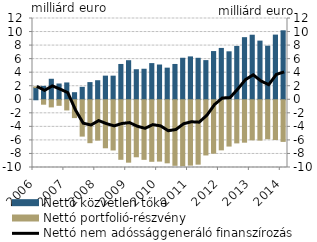
| Category | Nettó közvetlen tőke | Nettó portfolió-részvény |
|---|---|---|
| 2006.0 | 1.794 | 0.12 |
| 2006.0 | 1.974 | -0.655 |
| 2006.0 | 3.027 | -1.052 |
| 2006.0 | 2.327 | -0.819 |
| 2007.0 | 2.485 | -1.502 |
| 2007.0 | 1.045 | -2.631 |
| 2007.0 | 1.836 | -5.366 |
| 2007.0 | 2.537 | -6.338 |
| 2008.0 | 2.813 | -5.96 |
| 2008.0 | 3.491 | -7.088 |
| 2008.0 | 3.487 | -7.411 |
| 2008.0 | 5.213 | -8.79 |
| 2009.0 | 5.768 | -9.214 |
| 2009.0 | 4.436 | -8.417 |
| 2009.0 | 4.508 | -8.796 |
| 2009.0 | 5.342 | -9.085 |
| 2010.0 | 5.133 | -9.055 |
| 2010.0 | 4.669 | -9.31 |
| 2010.0 | 5.214 | -9.678 |
| 2010.0 | 6.129 | -9.737 |
| 2011.0 | 6.33 | -9.651 |
| 2011.0 | 6.124 | -9.505 |
| 2011.0 | 5.784 | -8.148 |
| 2011.0 | 7.119 | -7.887 |
| 2012.0 | 7.582 | -7.393 |
| 2012.0 | 7.082 | -6.834 |
| 2012.0 | 7.878 | -6.368 |
| 2012.0 | 9.17 | -6.264 |
| 2013.0 | 9.53 | -5.918 |
| 2013.0 | 8.661 | -5.957 |
| 2013.0 | 7.91 | -5.751 |
| 2013.0 | 9.549 | -5.871 |
| 2014.0 | 10.185 | -6.147 |